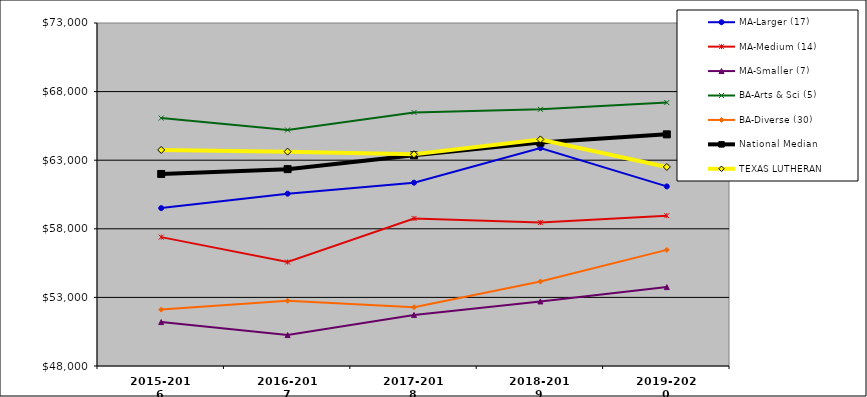
| Category | MA-Larger (17) | MA-Medium (14) | MA-Smaller (7) | BA-Arts & Sci (5) | BA-Diverse (30) | National Median | TEXAS LUTHERAN |
|---|---|---|---|---|---|---|---|
| 2015-2016 | 59508 | 57393 | 51201 | 66069 | 52110 | 61996.5 | 63747 |
| 2016-2017 | 60560 | 55577 | 50255 | 65204 | 52750.5 | 62349 | 63624 |
| 2017-2018 | 61362 | 58754 | 51721 | 66478 | 52284 | 63357 | 63432 |
| 2018-2019 | 63885 | 58453.5 | 52705 | 66706 | 54159.5 | 64282.5 | 64514 |
| 2019-2020 | 61090 | 58958 | 53752 | 67199 | 56463.5 | 64884.5 | 62508 |